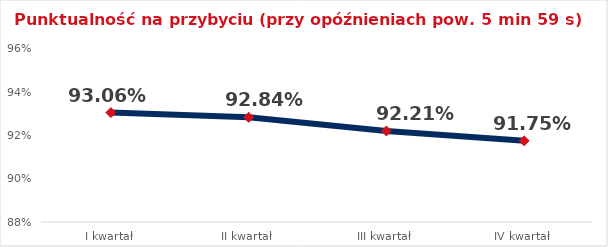
| Category | Series 0 |
|---|---|
| I kwartał | 0.931 |
| II kwartał | 0.928 |
| III kwartał | 0.922 |
| IV kwartał | 0.918 |